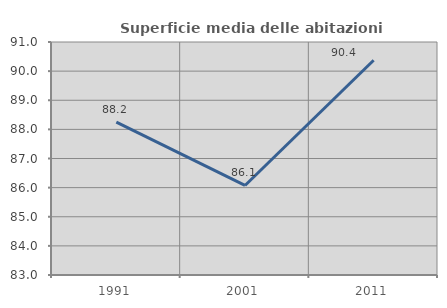
| Category | Superficie media delle abitazioni occupate |
|---|---|
| 1991.0 | 88.248 |
| 2001.0 | 86.074 |
| 2011.0 | 90.374 |